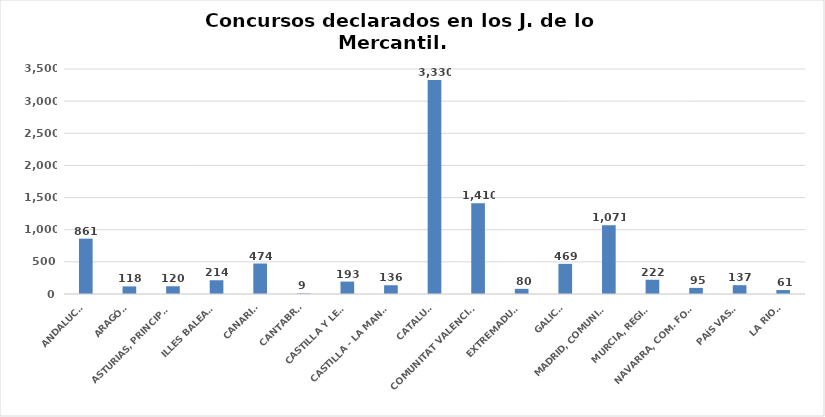
| Category | Series 0 |
|---|---|
| ANDALUCÍA | 861 |
| ARAGÓN | 118 |
| ASTURIAS, PRINCIPADO | 120 |
| ILLES BALEARS | 214 |
| CANARIAS | 474 |
| CANTABRIA | 9 |
| CASTILLA Y LEÓN | 193 |
| CASTILLA - LA MANCHA | 136 |
| CATALUÑA | 3330 |
| COMUNITAT VALENCIANA | 1410 |
| EXTREMADURA | 80 |
| GALICIA | 469 |
| MADRID, COMUNIDAD | 1071 |
| MURCIA, REGIÓN | 222 |
| NAVARRA, COM. FORAL | 95 |
| PAÍS VASCO | 137 |
| LA RIOJA | 61 |